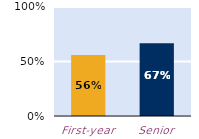
| Category | frequently |
|---|---|
| First-year | 0.559 |
| Senior | 0.668 |